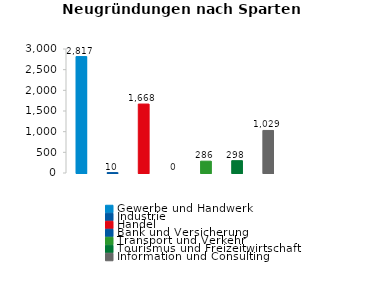
| Category | Series 1 |
|---|---|
| Gewerbe und Handwerk | 2817 |
| Industrie | 10 |
| Handel | 1668 |
| Bank und Versicherung | 0 |
| Transport und Verkehr | 286 |
| Tourismus und Freizeitwirtschaft | 298 |
| Information und Consulting | 1029 |